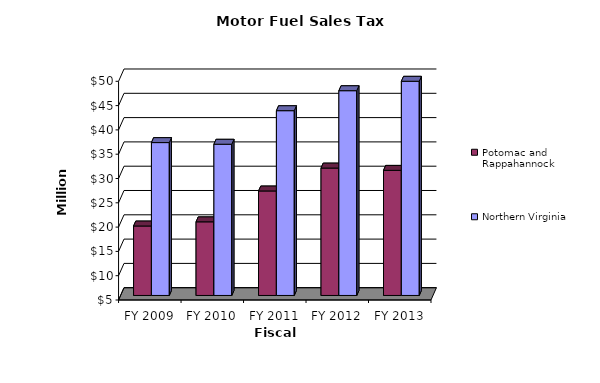
| Category | Potomac and Rappahannock | Northern Virginia |
|---|---|---|
| FY 2009 | 19.294 | 36.458 |
| FY 2010 | 20.152 | 36.12 |
| FY 2011 | 26.501 | 43.022 |
| FY 2012 | 31.216 | 47.134 |
| FY 2013 | 30.745 | 49.075 |